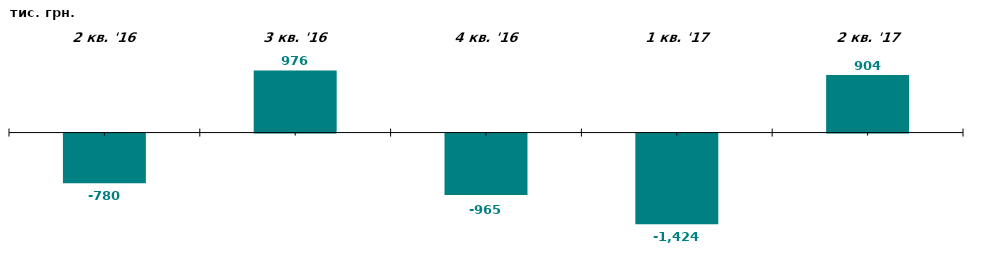
| Category | Чистий притік/відтік капіталу у 2-му кв. 2016-2017 рр., тис. грн. |
|---|---|
| 2 кв. '16 | -780.358 |
| 3 кв. '16 | 975.567 |
| 4 кв. '16 | -965.465 |
| 1 кв. '17 | -1423.808 |
| 2 кв. '17 | 903.571 |